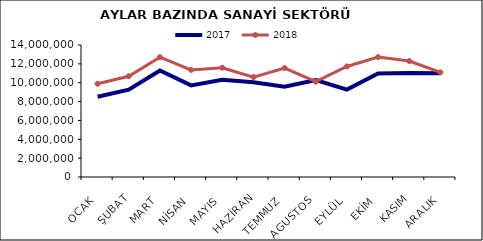
| Category | 2017 | 2018 |
|---|---|---|
| OCAK | 8505149.35 | 9886574.536 |
| ŞUBAT | 9254253.099 | 10688401.29 |
| MART | 11300769.271 | 12706887.085 |
| NİSAN | 9719380.051 | 11356000.054 |
| MAYIS | 10317159.488 | 11590880.532 |
| HAZİRAN | 10038747.126 | 10592692.599 |
| TEMMUZ | 9579124.663 | 11557677.632 |
| AGUSTOS | 10281999.995 | 10106949.947 |
| EYLÜL | 9271480.368 | 11723918.436 |
| EKİM | 10982435.013 | 12721942.101 |
| KASIM | 11029933.521 | 12296064.687 |
| ARALIK | 10998114.9 | 11097308.522 |